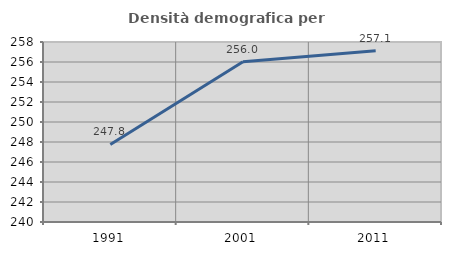
| Category | Densità demografica |
|---|---|
| 1991.0 | 247.751 |
| 2001.0 | 256.015 |
| 2011.0 | 257.122 |